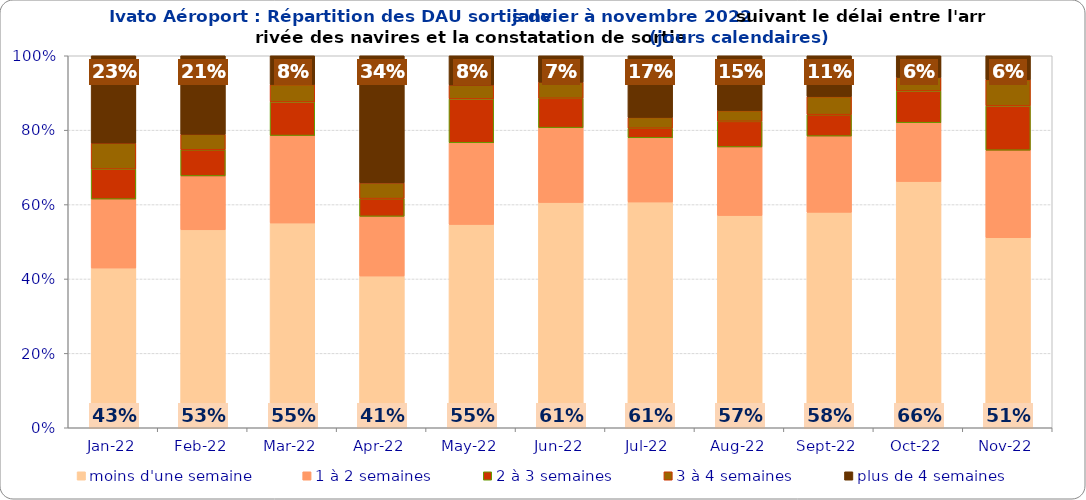
| Category | moins d'une semaine | 1 à 2 semaines | 2 à 3 semaines | 3 à 4 semaines | plus de 4 semaines |
|---|---|---|---|---|---|
| 2022-01-01 | 0.429 | 0.185 | 0.081 | 0.07 | 0.235 |
| 2022-02-01 | 0.532 | 0.145 | 0.07 | 0.041 | 0.211 |
| 2022-03-01 | 0.55 | 0.235 | 0.09 | 0.047 | 0.078 |
| 2022-04-01 | 0.408 | 0.16 | 0.048 | 0.042 | 0.342 |
| 2022-05-01 | 0.547 | 0.219 | 0.118 | 0.037 | 0.079 |
| 2022-06-01 | 0.606 | 0.201 | 0.079 | 0.043 | 0.071 |
| 2022-07-01 | 0.607 | 0.173 | 0.026 | 0.029 | 0.166 |
| 2022-08-01 | 0.571 | 0.184 | 0.069 | 0.029 | 0.147 |
| 2022-09-01 | 0.579 | 0.205 | 0.058 | 0.048 | 0.11 |
| 2022-10-01 | 0.662 | 0.158 | 0.085 | 0.036 | 0.058 |
| 2022-11-01 | 0.511 | 0.235 | 0.119 | 0.07 | 0.065 |